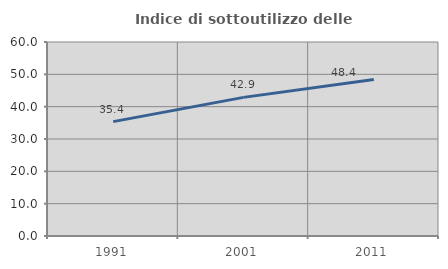
| Category | Indice di sottoutilizzo delle abitazioni  |
|---|---|
| 1991.0 | 35.38 |
| 2001.0 | 42.878 |
| 2011.0 | 48.414 |